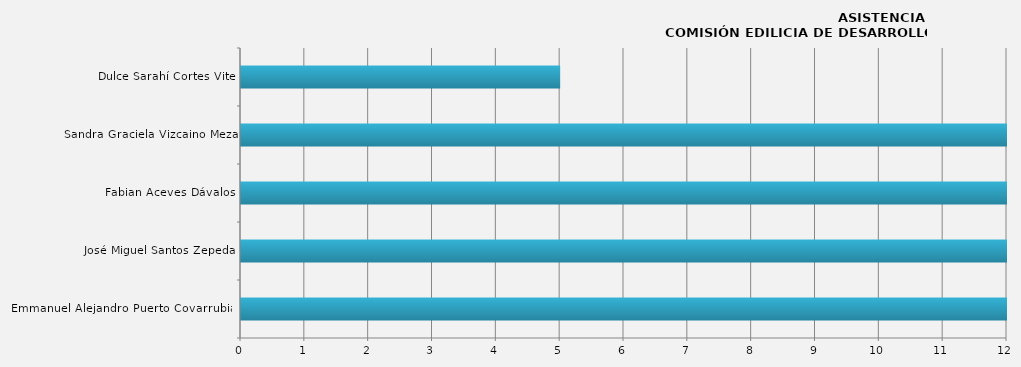
| Category | Series 0 |
|---|---|
| Emmanuel Alejandro Puerto Covarrubias | 12 |
| José Miguel Santos Zepeda | 12 |
| Fabian Aceves Dávalos | 12 |
| Sandra Graciela Vizcaino Meza | 12 |
| Dulce Sarahí Cortes Vite | 5 |